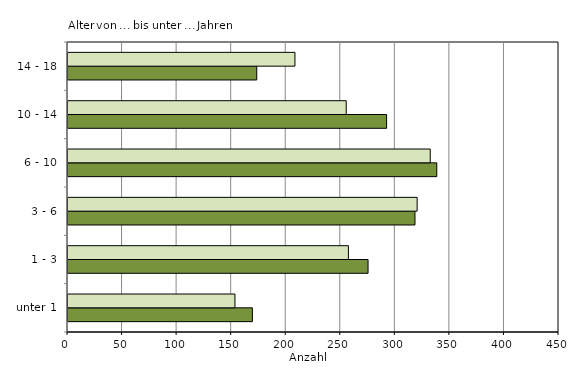
| Category | männlich | weiblich |
|---|---|---|
| unter 1 | 169 | 153 |
| 1 - 3 | 275 | 257 |
| 3 - 6 | 318 | 320 |
| 6 - 10 | 338 | 332 |
| 10 - 14 | 292 | 255 |
| 14 - 18 | 173 | 208 |